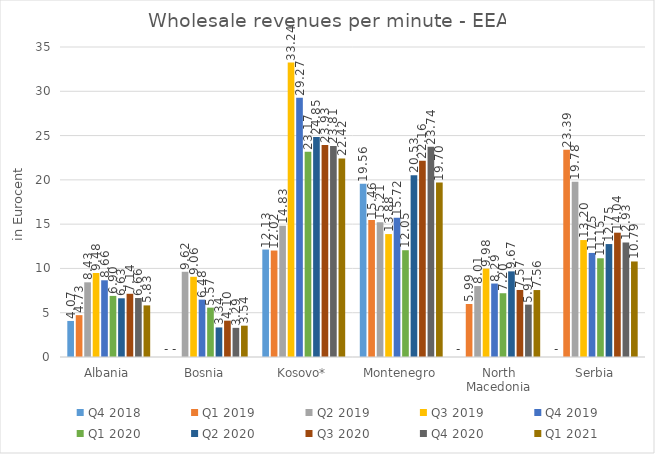
| Category | Q4 2018 | Q1 2019 | Q2 2019 | Q3 2019 | Q4 2019 | Q1 2020 | Q2 2020 | Q3 2020 | Q4 2020 | Q1 2021 |
|---|---|---|---|---|---|---|---|---|---|---|
| Albania | 4.07 | 4.725 | 8.432 | 9.481 | 8.66 | 6.897 | 6.628 | 7.137 | 6.658 | 5.826 |
| Bosnia | 0 | 0 | 9.622 | 9.056 | 6.476 | 5.575 | 3.336 | 4.101 | 3.291 | 3.537 |
| Kosovo* | 12.132 | 12.02 | 14.831 | 33.239 | 29.274 | 23.167 | 24.846 | 23.929 | 23.814 | 22.416 |
| Montenegro | 19.559 | 15.457 | 15.206 | 13.877 | 15.725 | 12.054 | 20.532 | 22.163 | 23.737 | 19.695 |
| North Macedonia | 0 | 5.986 | 8.007 | 9.978 | 8.294 | 7.2 | 9.668 | 7.568 | 5.913 | 7.559 |
| Serbia | 0 | 23.39 | 19.78 | 13.204 | 11.749 | 11.146 | 12.751 | 14.036 | 12.929 | 10.786 |